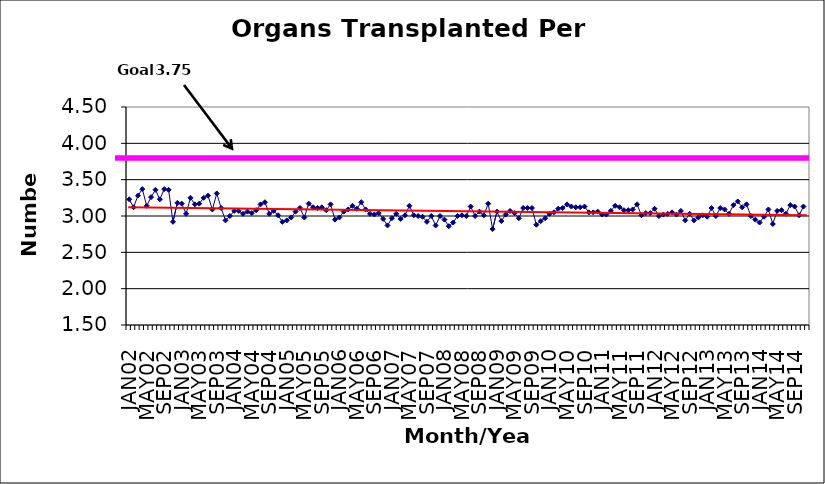
| Category | Series 0 |
|---|---|
| JAN02 | 3.23 |
| FEB02 | 3.12 |
| MAR02 | 3.28 |
| APR02 | 3.37 |
| MAY02 | 3.14 |
| JUN02 | 3.26 |
| JUL02 | 3.36 |
| AUG02 | 3.23 |
| SEP02 | 3.37 |
| OCT02 | 3.36 |
| NOV02 | 2.92 |
| DEC02 | 3.18 |
| JAN03 | 3.17 |
| FEB03 | 3.03 |
| MAR03 | 3.25 |
| APR03 | 3.16 |
| MAY03 | 3.17 |
| JUN03 | 3.25 |
| JUL03 | 3.28 |
| AUG03 | 3.09 |
| SEP03 | 3.31 |
| OCT03 | 3.11 |
| NOV03 | 2.94 |
| DEC03 | 3 |
| JAN04 | 3.07 |
| FEB04 | 3.07 |
| MAR04 | 3.03 |
| APR04 | 3.06 |
| MAY04 | 3.04 |
| JUN04 | 3.08 |
| JUL04 | 3.16 |
| AUG04 | 3.19 |
| SEP04 | 3.03 |
| OCT04 | 3.07 |
| NOV04 | 3.01 |
| DEC04 | 2.92 |
| JAN05 | 2.94 |
| FEB05 | 2.98 |
| MAR05 | 3.06 |
| APR05 | 3.11 |
| MAY05 | 2.98 |
| JUN05 | 3.17 |
| JUL05 | 3.12 |
| AUG05 | 3.11 |
| SEP05 | 3.12 |
| OCT05 | 3.08 |
| NOV05 | 3.16 |
| DEC05 | 2.95 |
| JAN06 | 2.98 |
| FEB06 | 3.06 |
| MAR06 | 3.09 |
| APR06 | 3.14 |
| MAY06 | 3.1 |
| JUN06 | 3.19 |
| JUL06 | 3.09 |
| AUG06 | 3.03 |
| SEP06 | 3.02 |
| OCT06 | 3.04 |
| NOV06 | 2.96 |
| DEC06 | 2.87 |
| JAN07 | 2.97 |
| FEB07 | 3.03 |
| MAR07 | 2.96 |
| APR07 | 3.01 |
| MAY07 | 3.14 |
| JUN07 | 3.01 |
| JUL07 | 3 |
| AUG07 | 2.99 |
| SEP07 | 2.92 |
| OCT07 | 3 |
| NOV07 | 2.87 |
| DEC07 | 3 |
| JAN08 | 2.95 |
| FEB08 | 2.86 |
| MAR08 | 2.91 |
| APR08 | 3 |
| MAY08 | 3.01 |
| JUN08 | 3 |
| JUL08 | 3.13 |
| AUG08 | 3 |
| SEP08 | 3.06 |
| OCT08 | 3.01 |
| NOV08 | 3.17 |
| DEC08 | 2.82 |
| JAN09 | 3.06 |
| FEB09 | 2.93 |
| MAR09 | 3.02 |
| APR09 | 3.07 |
| MAY09 | 3.04 |
| JUN09 | 2.97 |
| JUL09 | 3.11 |
| AUG09 | 3.11 |
| SEP09 | 3.11 |
| OCT09 | 2.88 |
| NOV09 | 2.93 |
| DEC09 | 2.97 |
| JAN10 | 3.03 |
| FEB10 | 3.05 |
| MAR10 | 3.1 |
| APR10 | 3.11 |
| MAY10 | 3.16 |
| JUN10 | 3.13 |
| JUL10 | 3.12 |
| AUG10 | 3.12 |
| SEP10 | 3.13 |
| OCT10 | 3.05 |
| NOV10 | 3.05 |
| DEC10 | 3.06 |
| JAN11 | 3.02 |
| FEB11 | 3.02 |
| MAR11 | 3.07 |
| APR11 | 3.14 |
| MAY11 | 3.12 |
| JUN11 | 3.08 |
| JUL11 | 3.08 |
| AUG11 | 3.09 |
| SEP11 | 3.16 |
| OCT11 | 3.01 |
| NOV11 | 3.04 |
| DEC11 | 3.04 |
| JAN12 | 3.1 |
| FEB12 | 3 |
| MAR12 | 3.02 |
| APR12 | 3.03 |
| MAY12 | 3.05 |
| JUN12 | 3.02 |
| JUL12 | 3.07 |
| AUG12 | 2.94 |
| SEP12 | 3.03 |
| OCT12 | 2.94 |
| NOV12 | 2.98 |
| DEC12 | 3.01 |
| JAN13 | 2.99 |
| FEB13 | 3.11 |
| MAR13 | 3 |
| APR13 | 3.11 |
| MAY13 | 3.09 |
| JUN13 | 3.03 |
| JUL13 | 3.15 |
| AUG13 | 3.2 |
| SEP13 | 3.12 |
| OCT13 | 3.16 |
| NOV13 | 3 |
| DEC13 | 2.95 |
| JAN14 | 2.91 |
| FEB14 | 2.99 |
| MAR14 | 3.09 |
| APR14 | 2.89 |
| MAY14 | 3.07 |
| JUN14 | 3.08 |
| JUL14 | 3.03 |
| AUG14 | 3.15 |
| SEP14 | 3.13 |
| OCT14 | 3.01 |
| NOV14 | 3.13 |